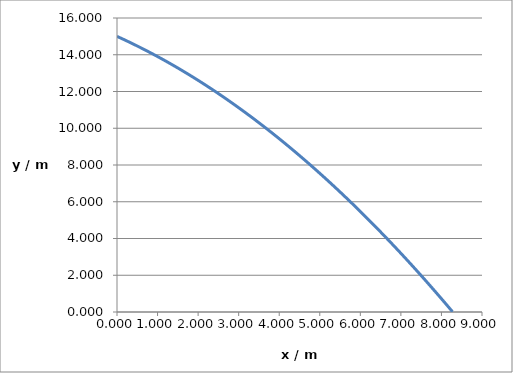
| Category | y / m |
|---|---|
| 0.0 | 15 |
| 0.07071067811865475 | 14.929 |
| 0.1414213562373095 | 14.857 |
| 0.21213203435596426 | 14.783 |
| 0.282842712474619 | 14.709 |
| 0.35355339059327373 | 14.634 |
| 0.42426406871192845 | 14.558 |
| 0.4949747468305832 | 14.481 |
| 0.5656854249492379 | 14.403 |
| 0.6363961030678926 | 14.324 |
| 0.7071067811865474 | 14.244 |
| 0.7778174593052021 | 14.163 |
| 0.8485281374238568 | 14.081 |
| 0.9192388155425115 | 13.998 |
| 0.9899494936611662 | 13.914 |
| 1.060660171779821 | 13.829 |
| 1.1313708498984758 | 13.743 |
| 1.2020815280171306 | 13.656 |
| 1.2727922061357855 | 13.568 |
| 1.3435028842544403 | 13.479 |
| 1.4142135623730951 | 13.39 |
| 1.48492424049175 | 13.299 |
| 1.5556349186104048 | 13.207 |
| 1.6263455967290597 | 13.114 |
| 1.6970562748477145 | 13.02 |
| 1.7677669529663693 | 12.926 |
| 1.8384776310850242 | 12.83 |
| 1.909188309203679 | 12.733 |
| 1.9798989873223338 | 12.636 |
| 2.0506096654409887 | 12.537 |
| 2.1213203435596433 | 12.437 |
| 2.192031021678298 | 12.337 |
| 2.2627416997969525 | 12.235 |
| 2.333452377915607 | 12.132 |
| 2.4041630560342617 | 12.029 |
| 2.4748737341529163 | 11.924 |
| 2.545584412271571 | 11.819 |
| 2.6162950903902256 | 11.712 |
| 2.68700576850888 | 11.605 |
| 2.757716446627535 | 11.496 |
| 2.8284271247461894 | 11.387 |
| 2.899137802864844 | 11.276 |
| 2.9698484809834986 | 11.165 |
| 3.0405591591021532 | 11.053 |
| 3.111269837220808 | 10.939 |
| 3.1819805153394625 | 10.825 |
| 3.252691193458117 | 10.709 |
| 3.3234018715767717 | 10.593 |
| 3.3941125496954263 | 10.476 |
| 3.464823227814081 | 10.357 |
| 3.5355339059327355 | 10.238 |
| 3.60624458405139 | 10.118 |
| 3.6769552621700448 | 9.997 |
| 3.7476659402886994 | 9.875 |
| 3.818376618407354 | 9.751 |
| 3.8890872965260086 | 9.627 |
| 3.959797974644663 | 9.502 |
| 4.030508652763318 | 9.376 |
| 4.101219330881973 | 9.249 |
| 4.1719300090006275 | 9.121 |
| 4.242640687119282 | 8.992 |
| 4.313351365237937 | 8.861 |
| 4.384062043356591 | 8.73 |
| 4.454772721475246 | 8.598 |
| 4.525483399593901 | 8.465 |
| 4.596194077712555 | 8.331 |
| 4.66690475583121 | 8.196 |
| 4.737615433949864 | 8.061 |
| 4.808326112068519 | 7.924 |
| 4.879036790187174 | 7.786 |
| 4.949747468305828 | 7.647 |
| 5.020458146424483 | 7.507 |
| 5.0911688245431375 | 7.366 |
| 5.161879502661792 | 7.224 |
| 5.232590180780447 | 7.081 |
| 5.303300858899101 | 6.938 |
| 5.374011537017756 | 6.793 |
| 5.4447222151364105 | 6.647 |
| 5.515432893255065 | 6.5 |
| 5.58614357137372 | 6.353 |
| 5.656854249492374 | 6.204 |
| 5.727564927611029 | 6.054 |
| 5.798275605729684 | 5.904 |
| 5.868986283848338 | 5.752 |
| 5.939696961966993 | 5.599 |
| 6.010407640085647 | 5.446 |
| 6.081118318204302 | 5.291 |
| 6.151828996322957 | 5.136 |
| 6.222539674441611 | 4.979 |
| 6.293250352560266 | 4.821 |
| 6.3639610306789205 | 4.663 |
| 6.434671708797575 | 4.503 |
| 6.50538238691623 | 4.343 |
| 6.576093065034884 | 4.182 |
| 6.646803743153539 | 4.019 |
| 6.717514421272194 | 3.856 |
| 6.788225099390848 | 3.691 |
| 6.858935777509503 | 3.526 |
| 6.929646455628157 | 3.36 |
| 7.000357133746812 | 3.192 |
| 7.071067811865467 | 3.024 |
| 7.141778489984121 | 2.855 |
| 7.212489168102776 | 2.684 |
| 7.2831998462214305 | 2.513 |
| 7.353910524340085 | 2.341 |
| 7.42462120245874 | 2.168 |
| 7.495331880577394 | 1.993 |
| 7.566042558696049 | 1.818 |
| 7.6367532368147035 | 1.642 |
| 7.707463914933358 | 1.465 |
| 7.778174593052013 | 1.287 |
| 7.848885271170667 | 1.108 |
| 7.919595949289322 | 0.928 |
| 7.990306627407977 | 0.746 |
| 8.061017305526631 | 0.564 |
| 8.131727983645286 | 0.381 |
| 8.20243866176394 | 0.197 |
| 8.273149339882595 | 0.012 |